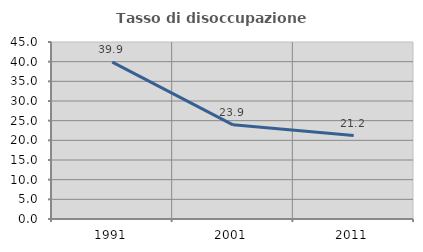
| Category | Tasso di disoccupazione giovanile  |
|---|---|
| 1991.0 | 39.868 |
| 2001.0 | 23.938 |
| 2011.0 | 21.226 |